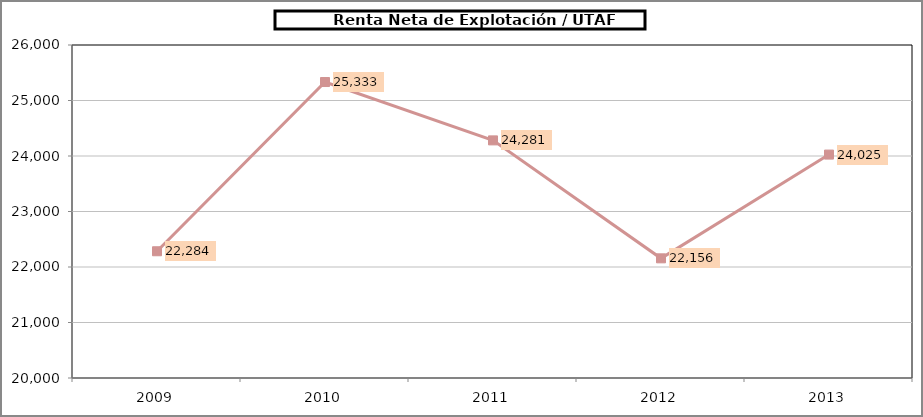
| Category |      Renta Neta de Explotación / UTAF (euros/UTA) |
|---|---|
| 2009.0 | 22283.65 |
| 2010.0 | 25333.047 |
| 2011.0 | 24281.419 |
| 2012.0 | 22156.22 |
| 2013.0 | 24025.487 |